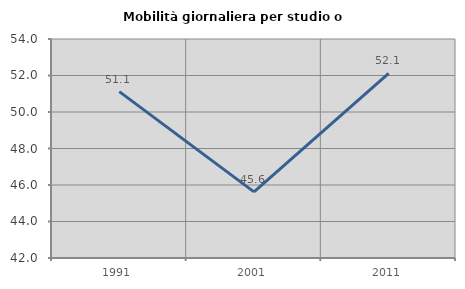
| Category | Mobilità giornaliera per studio o lavoro |
|---|---|
| 1991.0 | 51.118 |
| 2001.0 | 45.625 |
| 2011.0 | 52.113 |